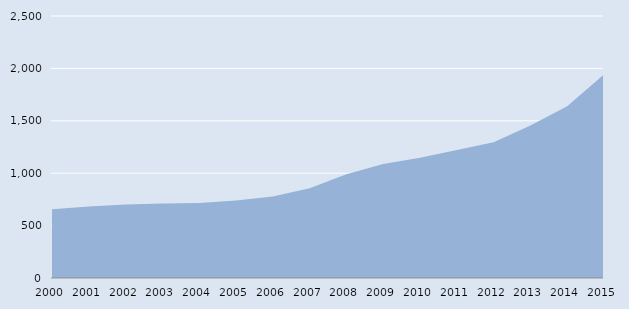
| Category | Series 0 |
|---|---|
| 2000.0 | 657 |
| 2001.0 | 683 |
| 2002.0 | 701 |
| 2003.0 | 711 |
| 2004.0 | 716 |
| 2005.0 | 740 |
| 2006.0 | 778 |
| 2007.0 | 857 |
| 2008.0 | 989 |
| 2009.0 | 1088 |
| 2010.0 | 1148 |
| 2011.0 | 1221 |
| 2012.0 | 1296 |
| 2013.0 | 1455 |
| 2014.0 | 1640 |
| 2015.0 | 1943 |